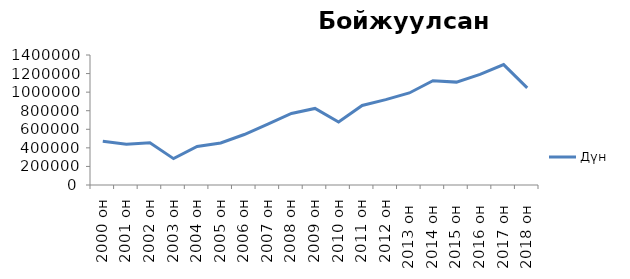
| Category | Дүн  |
|---|---|
| 2000 он | 472256 |
| 2001 он | 438584 |
| 2002 он | 455963 |
| 2003 он | 284078 |
| 2004 он | 414539 |
| 2005 он | 452448 |
| 2006 он | 543597 |
| 2007 он | 656227 |
| 2008 он | 770961 |
| 2009 он | 824840 |
| 2010 он | 678595 |
| 2011 он | 856243 |
| 2012 oн | 919441 |
| 2013 он  | 991181 |
| 2014 он  | 1122965 |
| 2015 он  | 1108009 |
| 2016 он  | 1190710 |
| 2017 он  | 1296307 |
| 2018 он  | 1045297 |